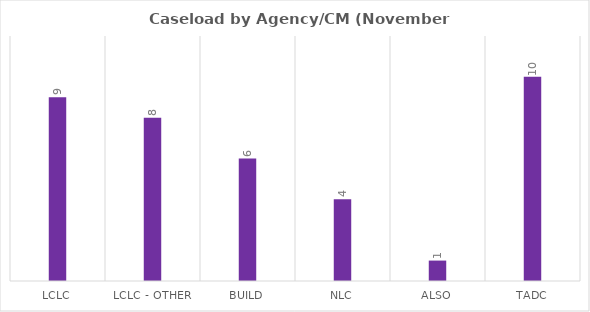
| Category | Series 0 |
|---|---|
| LCLC | 9 |
| LCLC - Other | 8 |
| BUILD | 6 |
| NLC | 4 |
| ALSO | 1 |
| TADC | 10 |